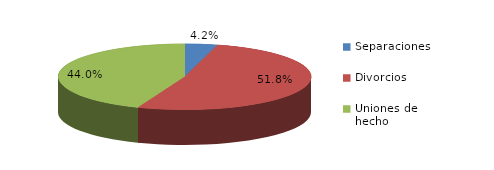
| Category | Series 0 |
|---|---|
| Separaciones | 57 |
| Divorcios | 709 |
| Uniones de hecho | 602 |